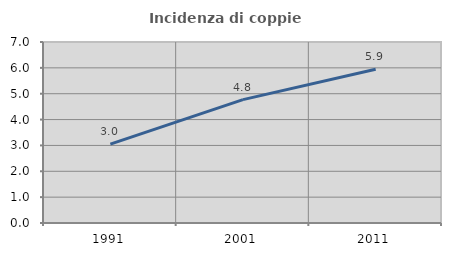
| Category | Incidenza di coppie miste |
|---|---|
| 1991.0 | 3.048 |
| 2001.0 | 4.77 |
| 2011.0 | 5.949 |